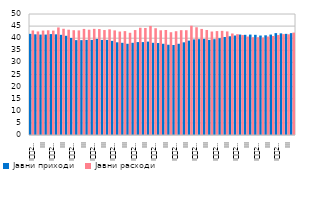
| Category | Јавни приходи  | Јавни расходи  |
|---|---|---|
| I
2007. | 41.8 | 43.2 |
| II | 41.6 | 42.792 |
| III | 41.5 | 43.161 |
| IV | 41.5 | 43.268 |
| I
2008. | 41.7 | 43.139 |
| II | 41.6 | 44.449 |
| III | 41.4 | 43.897 |
| IV | 41 | 43.511 |
| I
2009. | 40.1 | 43.301 |
| II | 39.2 | 43.223 |
| III | 39.2 | 43.838 |
| IV | 39.3 | 43.508 |
| I
2010. | 39.3 | 43.863 |
| II | 39.7 | 43.782 |
| III | 39.3 | 43.371 |
| IV | 39.3 | 43.668 |
| I
2011. | 38.9 | 43.234 |
| II | 38.3 | 42.761 |
| III | 38.1 | 42.925 |
| IV | 37.7 | 42.248 |
| I
2012. | 38.1 | 43.358 |
| II | 38.4 | 44.317 |
| III | 38.4 | 44.213 |
| IV | 38.6 | 45.073 |
| I
2013. | 38.1 | 44.124 |
| II | 38 | 43.272 |
| III | 37.7 | 43.393 |
| IV | 37.3 | 42.467 |
| I
2014. | 37.2 | 42.885 |
| II | 37.7 | 43.315 |
| III | 38.3 | 43.303 |
| IV | 39 | 45.159 |
| I
2015. | 39.5 | 44.522 |
| II | 39.6 | 43.838 |
| III | 39.7 | 43.382 |
| IV | 39.3 | 42.763 |
| I
2016. | 39.6 | 42.941 |
| II | 40 | 43.04 |
| III | 40.5 | 42.804 |
| IV | 40.8 | 41.95 |
| I
2017. | 41.1 | 41.639 |
| II | 41.5 | 41.305 |
| III | 41.4 | 40.697 |
| IV | 41.5 | 40.407 |
| I
2018. | 41.4 | 40.4 |
| II | 41.1 | 40.3 |
| III | 41.2 | 40.7 |
| IV | 41.5 | 40.9 |
| I
2019. | 42.1 | 41.324 |
| II | 42 | 41.677 |
| III | 41.8 | 41.616 |
| IV | 42.1 | 42.319 |